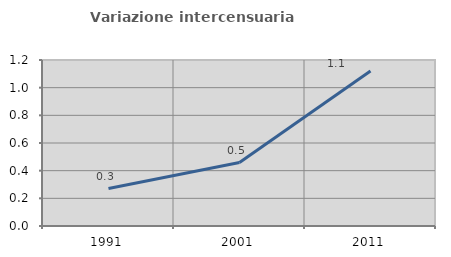
| Category | Variazione intercensuaria annua |
|---|---|
| 1991.0 | 0.271 |
| 2001.0 | 0.459 |
| 2011.0 | 1.121 |